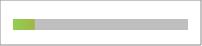
| Category | Series 0 |
|---|---|
| 0 | -0.306 |